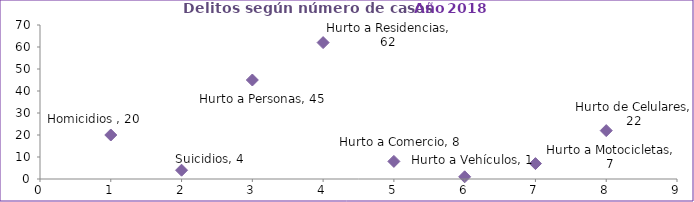
| Category | Series 0 |
|---|---|
| 0 | 20 |
| 1 | 4 |
| 2 | 45 |
| 3 | 62 |
| 4 | 8 |
| 5 | 1 |
| 6 | 7 |
| 7 | 22 |